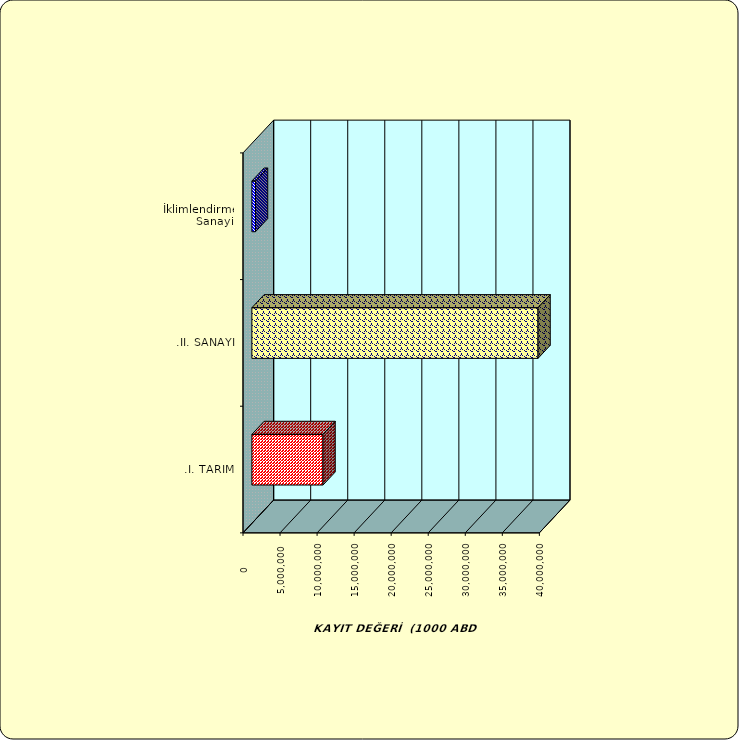
| Category | Series 0 |
|---|---|
| .I. TARIM | 9602767.454 |
| .II. SANAYİ | 38620842.261 |
|  İklimlendirme Sanayii | 487659.843 |